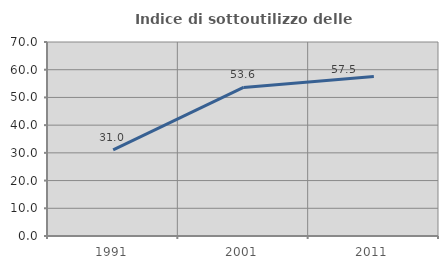
| Category | Indice di sottoutilizzo delle abitazioni  |
|---|---|
| 1991.0 | 31.049 |
| 2001.0 | 53.612 |
| 2011.0 | 57.526 |